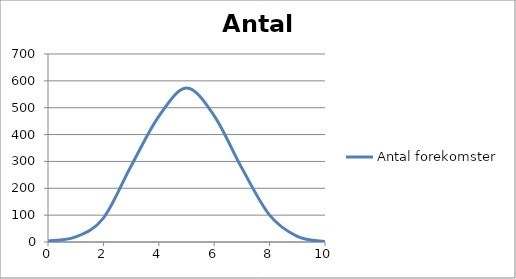
| Category | Antal forekomster |
|---|---|
| 0.0 | 4 |
| 1.0 | 19 |
| 2.0 | 89 |
| 3.0 | 283 |
| 4.0 | 468 |
| 5.0 | 573 |
| 6.0 | 470 |
| 7.0 | 275 |
| 8.0 | 100 |
| 9.0 | 21 |
| 10.0 | 1 |